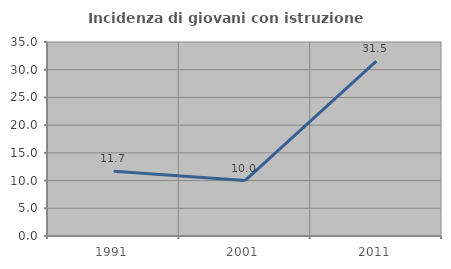
| Category | Incidenza di giovani con istruzione universitaria |
|---|---|
| 1991.0 | 11.702 |
| 2001.0 | 10 |
| 2011.0 | 31.538 |